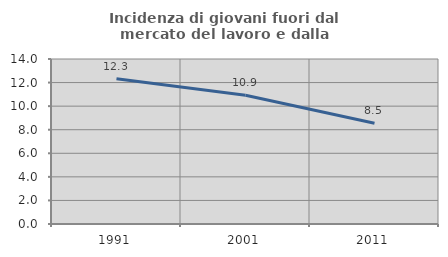
| Category | Incidenza di giovani fuori dal mercato del lavoro e dalla formazione  |
|---|---|
| 1991.0 | 12.322 |
| 2001.0 | 10.924 |
| 2011.0 | 8.545 |